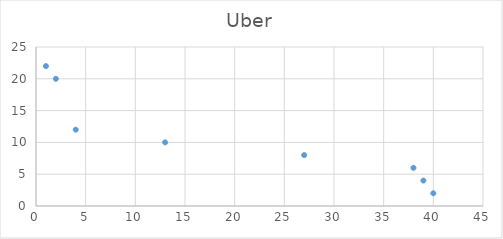
| Category | Uber |
|---|---|
| 40.0 | 2 |
| 39.0 | 4 |
| 38.0 | 6 |
| 27.0 | 8 |
| 13.0 | 10 |
| 4.0 | 12 |
| 2.0 | 20 |
| 1.0 | 22 |